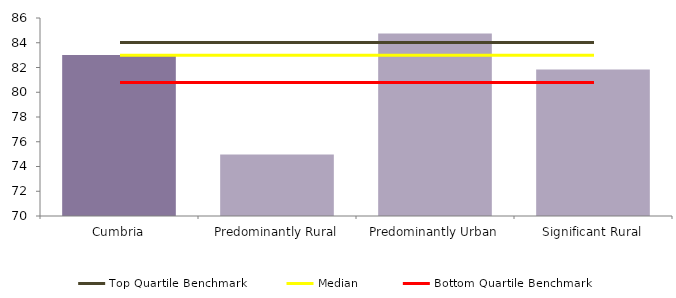
| Category | Series 0 |
|---|---|
| Cumbria | 83.003 |
| Predominantly Rural | 74.965 |
| Predominantly Urban | 84.756 |
| Significant Rural | 81.847 |